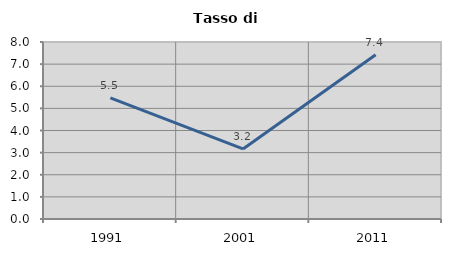
| Category | Tasso di disoccupazione   |
|---|---|
| 1991.0 | 5.472 |
| 2001.0 | 3.166 |
| 2011.0 | 7.42 |